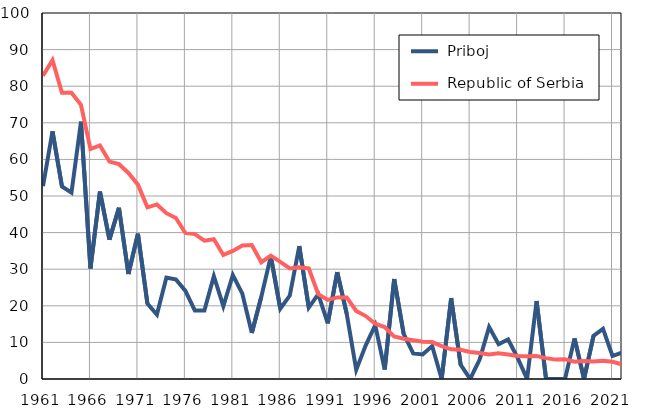
| Category |  Priboj |  Republic of Serbia |
|---|---|---|
| 1961.0 | 52.7 | 82.9 |
| 1962.0 | 67.7 | 87.1 |
| 1963.0 | 52.6 | 78.2 |
| 1964.0 | 50.9 | 78.2 |
| 1965.0 | 70.3 | 74.9 |
| 1966.0 | 30.2 | 62.8 |
| 1967.0 | 51.2 | 63.8 |
| 1968.0 | 38.1 | 59.4 |
| 1969.0 | 46.8 | 58.7 |
| 1970.0 | 28.7 | 56.3 |
| 1971.0 | 39.7 | 53.1 |
| 1972.0 | 20.6 | 46.9 |
| 1973.0 | 17.6 | 47.7 |
| 1974.0 | 27.7 | 45.3 |
| 1975.0 | 27.2 | 44 |
| 1976.0 | 24.1 | 39.9 |
| 1977.0 | 18.7 | 39.6 |
| 1978.0 | 18.7 | 37.8 |
| 1979.0 | 28.1 | 38.2 |
| 1980.0 | 19.9 | 33.9 |
| 1981.0 | 28.4 | 35 |
| 1982.0 | 23.3 | 36.5 |
| 1983.0 | 12.6 | 36.6 |
| 1984.0 | 22.5 | 31.9 |
| 1985.0 | 33.5 | 33.7 |
| 1986.0 | 19.2 | 32 |
| 1987.0 | 22.8 | 30.2 |
| 1988.0 | 36.3 | 30.5 |
| 1989.0 | 19.5 | 30.2 |
| 1990.0 | 23.2 | 23.2 |
| 1991.0 | 15.2 | 21.6 |
| 1992.0 | 29.2 | 22.3 |
| 1993.0 | 17.8 | 22.3 |
| 1994.0 | 2.5 | 18.6 |
| 1995.0 | 9.2 | 17.2 |
| 1996.0 | 14.7 | 15.1 |
| 1997.0 | 2.6 | 14.2 |
| 1998.0 | 27.3 | 11.6 |
| 1999.0 | 12.3 | 11 |
| 2000.0 | 7 | 10.6 |
| 2001.0 | 6.7 | 10.2 |
| 2002.0 | 9 | 10.1 |
| 2003.0 | 0 | 9 |
| 2004.0 | 22.1 | 8.1 |
| 2005.0 | 3.9 | 8 |
| 2006.0 | 0 | 7.4 |
| 2007.0 | 5.3 | 7.1 |
| 2008.0 | 14.2 | 6.7 |
| 2009.0 | 9.5 | 7 |
| 2010.0 | 10.8 | 6.7 |
| 2011.0 | 5.8 | 6.3 |
| 2012.0 | 0 | 6.2 |
| 2013.0 | 21.3 | 6.3 |
| 2014.0 | 0 | 5.7 |
| 2015.0 | 0 | 5.3 |
| 2016.0 | 0 | 5.4 |
| 2017.0 | 11.1 | 4.7 |
| 2018.0 | 0 | 4.9 |
| 2019.0 | 11.8 | 4.8 |
| 2020.0 | 13.7 | 5 |
| 2021.0 | 6.3 | 4.7 |
| 2022.0 | 7.2 | 4 |